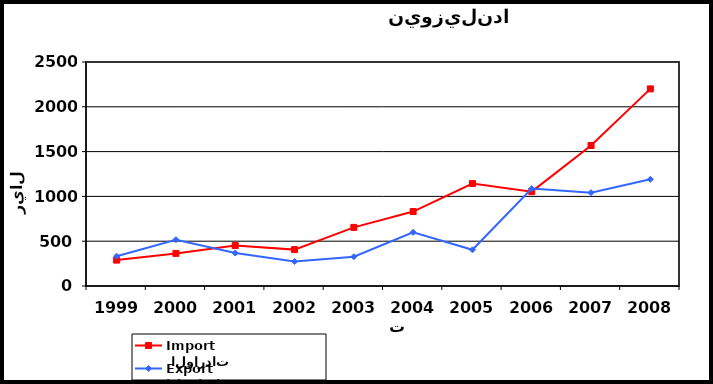
| Category |  الواردات           Import | الصادرات          Export |
|---|---|---|
| 1999.0 | 289 | 333 |
| 2000.0 | 364 | 517 |
| 2001.0 | 451 | 368 |
| 2002.0 | 406 | 273 |
| 2003.0 | 654 | 327 |
| 2004.0 | 831 | 599 |
| 2005.0 | 1143 | 404 |
| 2006.0 | 1053 | 1087 |
| 2007.0 | 1568 | 1042 |
| 2008.0 | 2200 | 1191 |